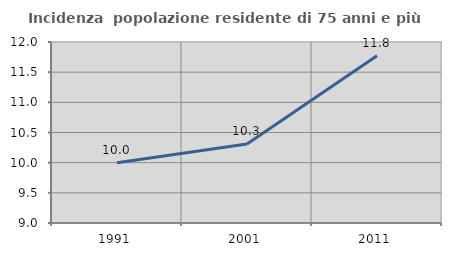
| Category | Incidenza  popolazione residente di 75 anni e più |
|---|---|
| 1991.0 | 10 |
| 2001.0 | 10.308 |
| 2011.0 | 11.773 |